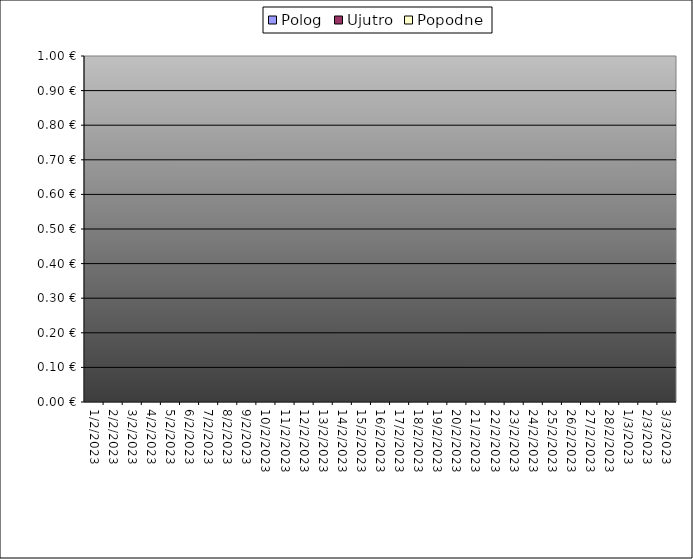
| Category | Polog | Ujutro | Popodne |
|---|---|---|---|
| 2023-02-01 |  | 0 | 0 |
| 2023-02-02 |  | 0 | 0 |
| 2023-02-03 |  | 0 | 0 |
| 2023-02-04 |  | 0 | 0 |
| 2023-02-05 |  | 0 | 0 |
| 2023-02-06 |  | 0 | 0 |
| 2023-02-07 |  | 0 | 0 |
| 2023-02-08 |  | 0 | 0 |
| 2023-02-09 |  | 0 | 0 |
| 2023-02-10 |  | 0 | 0 |
| 2023-02-11 |  | 0 | 0 |
| 2023-02-12 |  | 0 | 0 |
| 2023-02-13 |  | 0 | 0 |
| 2023-02-14 |  | 0 | 0 |
| 2023-02-15 |  | 0 | 0 |
| 2023-02-16 |  | 0 | 0 |
| 2023-02-17 |  | 0 | 0 |
| 2023-02-18 |  | 0 | 0 |
| 2023-02-19 |  | 0 | 0 |
| 2023-02-20 |  | 0 | 0 |
| 2023-02-21 |  | 0 | 0 |
| 2023-02-22 |  | 0 | 0 |
| 2023-02-23 |  | 0 | 0 |
| 2023-02-24 |  | 0 | 0 |
| 2023-02-25 |  | 0 | 0 |
| 2023-02-26 |  | 0 | 0 |
| 2023-02-27 |  | 0 | 0 |
| 2023-02-28 |  | 0 | 0 |
| 2023-03-01 |  | 0 | 0 |
| 2023-03-02 |  | 0 | 0 |
| 2023-03-03 |  | 0 | 0 |